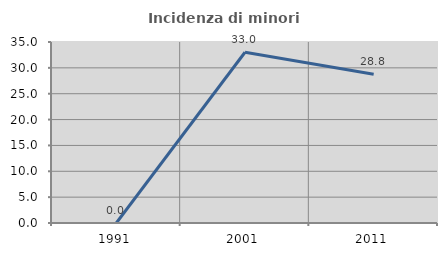
| Category | Incidenza di minori stranieri |
|---|---|
| 1991.0 | 0 |
| 2001.0 | 33.019 |
| 2011.0 | 28.778 |